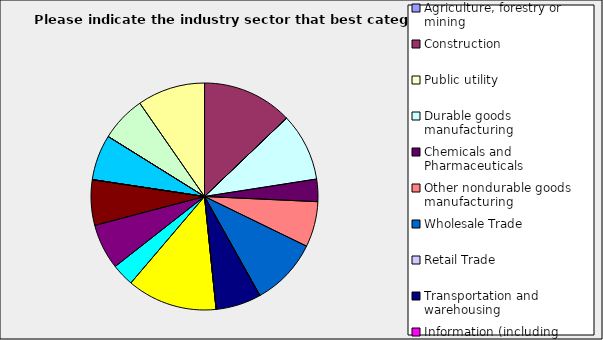
| Category | Series 0 |
|---|---|
| Agriculture, forestry or mining | 0 |
| Construction | 0.129 |
| Public utility | 0 |
| Durable goods manufacturing | 0.097 |
| Chemicals and Pharmaceuticals | 0.032 |
| Other nondurable goods manufacturing | 0.065 |
| Wholesale Trade | 0.097 |
| Retail Trade | 0 |
| Transportation and warehousing | 0.065 |
| Information (including broadcasting and telecommunication) | 0 |
| Finance and Insurance | 0.129 |
| Real Estate | 0.032 |
| Professional, scientific and technical services | 0.065 |
| Consulting | 0.065 |
| Administrative and office services (including waste management) | 0 |
| Education | 0 |
| Health Care and social services | 0.065 |
| Arts, entertainment and recreation | 0 |
| Accommodation and food services | 0.065 |
| Other | 0.097 |